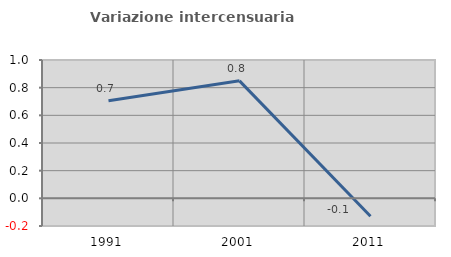
| Category | Variazione intercensuaria annua |
|---|---|
| 1991.0 | 0.706 |
| 2001.0 | 0.849 |
| 2011.0 | -0.129 |